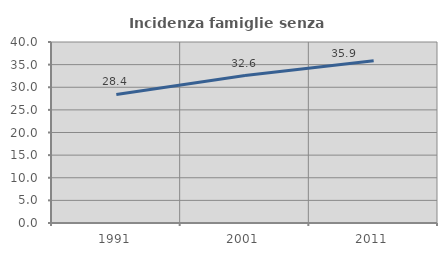
| Category | Incidenza famiglie senza nuclei |
|---|---|
| 1991.0 | 28.415 |
| 2001.0 | 32.573 |
| 2011.0 | 35.852 |